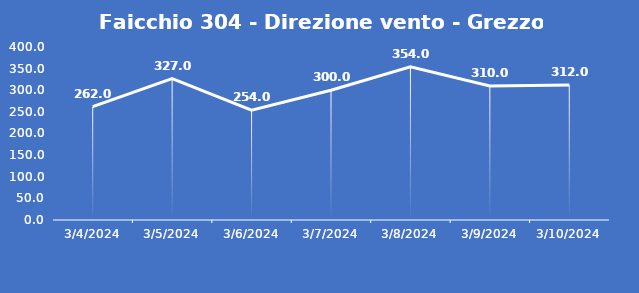
| Category | Faicchio 304 - Direzione vento - Grezzo (°N) |
|---|---|
| 3/4/24 | 262 |
| 3/5/24 | 327 |
| 3/6/24 | 254 |
| 3/7/24 | 300 |
| 3/8/24 | 354 |
| 3/9/24 | 310 |
| 3/10/24 | 312 |